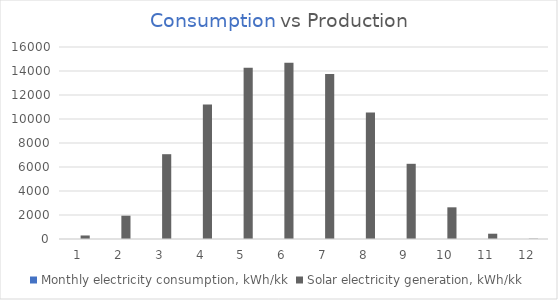
| Category | Monthly electricity consumption, kWh/kk | Solar electricity generation, kWh/kk |
|---|---|---|
| 0 | 0 | 293.67 |
| 1 | 0 | 1941.93 |
| 2 | 0 | 7067.17 |
| 3 | 0 | 11208.09 |
| 4 | 0 | 14265.98 |
| 5 | 0 | 14691.15 |
| 6 | 0 | 13760.09 |
| 7 | 0 | 10548.94 |
| 8 | 0 | 6266.45 |
| 9 | 0 | 2639.95 |
| 10 | 0 | 440.63 |
| 11 | 0 | 27.69 |